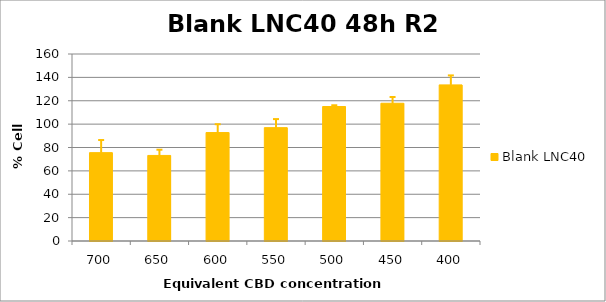
| Category | Blank LNC40 |
|---|---|
| 700.0 | 75.606 |
| 650.0 | 73.207 |
| 600.0 | 92.793 |
| 550.0 | 96.997 |
| 500.0 | 115.062 |
| 450.0 | 117.854 |
| 400.0 | 133.577 |